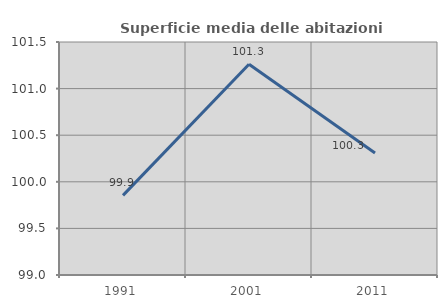
| Category | Superficie media delle abitazioni occupate |
|---|---|
| 1991.0 | 99.854 |
| 2001.0 | 101.262 |
| 2011.0 | 100.309 |